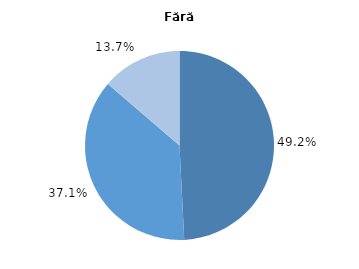
| Category | Fără migranți |
|---|---|
| 0 | 49.2 |
| 1 | 37.1 |
| 2 | 13.7 |